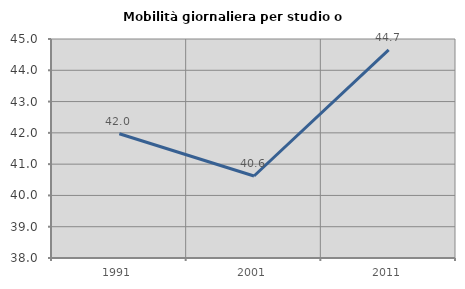
| Category | Mobilità giornaliera per studio o lavoro |
|---|---|
| 1991.0 | 41.972 |
| 2001.0 | 40.621 |
| 2011.0 | 44.653 |